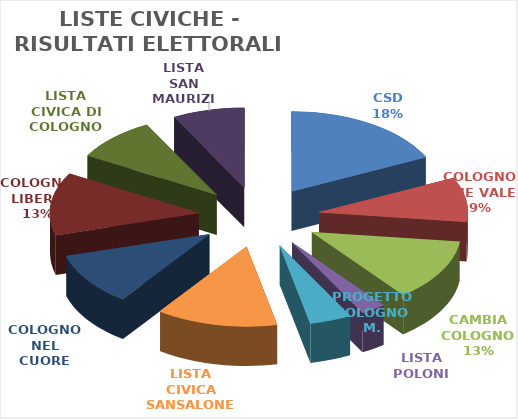
| Category | Series 0 | Series 1 |
|---|---|---|
| CSD | 0.179 | 1359 |
| COLOGNO CHE VALE | 0.09 | 683 |
| CAMBIA COLOGNO | 0.125 | 951 |
| LISTA POLONI | 0.027 | 204 |
| PROGETTO COLOGNO M. | 0.045 | 344 |
| LISTA CIVICA SANSALONE | 0.132 | 998 |
| COLOGNO NEL CUORE | 0.107 | 811 |
| COLOGNO LIBERA | 0.127 | 963 |
| LISTA CIVICA DI COLOGNO | 0.089 | 677 |
| LISTA SAN MAURIZIO | 0.078 | 592 |